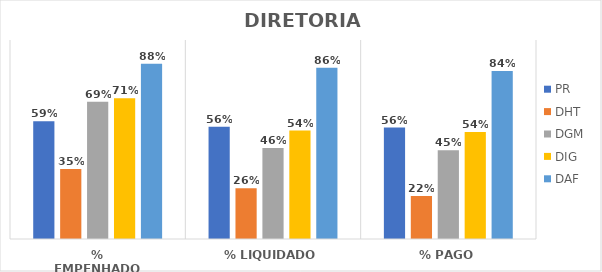
| Category | PR | DHT | DGM | DIG | DAF |
|---|---|---|---|---|---|
| % EMPENHADO | 0.592 | 0.352 | 0.689 | 0.708 | 0.881 |
| % LIQUIDADO | 0.564 | 0.255 | 0.458 | 0.545 | 0.861 |
| % PAGO | 0.56 | 0.216 | 0.446 | 0.538 | 0.844 |